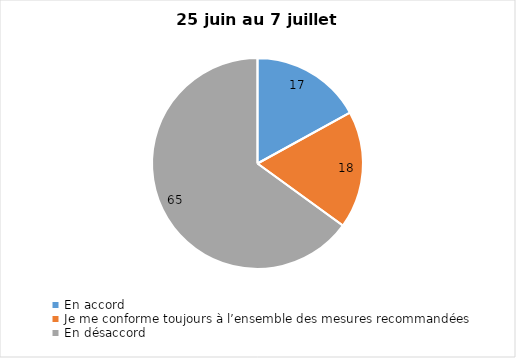
| Category | Series 0 |
|---|---|
| En accord | 17 |
| Je me conforme toujours à l’ensemble des mesures recommandées | 18 |
| En désaccord | 65 |